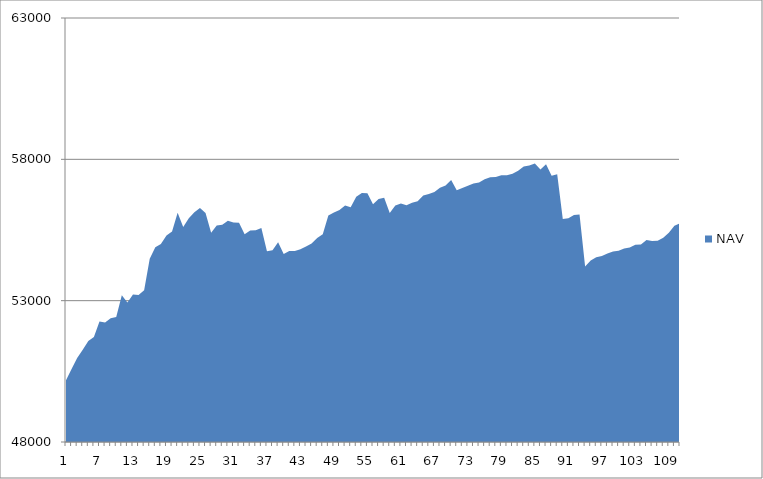
| Category | NAV |
|---|---|
| 0 | 50185.185 |
| 1 | 50585.185 |
| 2 | 50973.977 |
| 3 | 51265.977 |
| 4 | 51576.741 |
| 5 | 51711.523 |
| 6 | 52262.893 |
| 7 | 52230.24 |
| 8 | 52381.556 |
| 9 | 52425.915 |
| 10 | 53192.581 |
| 11 | 52939.146 |
| 12 | 53220.069 |
| 13 | 53197.341 |
| 14 | 53369.61 |
| 15 | 54480.721 |
| 16 | 54888.365 |
| 17 | 55001.902 |
| 18 | 55308.308 |
| 19 | 55448.308 |
| 20 | 56110.305 |
| 21 | 55610.305 |
| 22 | 55916.954 |
| 23 | 56129.798 |
| 24 | 56279.798 |
| 25 | 56105.301 |
| 26 | 55401.645 |
| 27 | 55657.201 |
| 28 | 55686.925 |
| 29 | 55823.001 |
| 30 | 55769.596 |
| 31 | 55759.375 |
| 32 | 55350.284 |
| 33 | 55480.284 |
| 34 | 55492.498 |
| 35 | 55570.42 |
| 36 | 54746.89 |
| 37 | 54783.7 |
| 38 | 55066.459 |
| 39 | 54651.074 |
| 40 | 54754.078 |
| 41 | 54760.213 |
| 42 | 54816.924 |
| 43 | 54917.296 |
| 44 | 55025.73 |
| 45 | 55220.535 |
| 46 | 55353.465 |
| 47 | 56009.309 |
| 48 | 56118.959 |
| 49 | 56205.212 |
| 50 | 56362.876 |
| 51 | 56307.394 |
| 52 | 56678.935 |
| 53 | 56813.264 |
| 54 | 56799.502 |
| 55 | 56409.112 |
| 56 | 56596.44 |
| 57 | 56640.493 |
| 58 | 56102.227 |
| 59 | 56370.449 |
| 60 | 56434.248 |
| 61 | 56376.841 |
| 62 | 56464.524 |
| 63 | 56518.022 |
| 64 | 56724.747 |
| 65 | 56770.361 |
| 66 | 56848.099 |
| 67 | 56992.896 |
| 68 | 57073.571 |
| 69 | 57266.481 |
| 70 | 56908.016 |
| 71 | 56984.939 |
| 72 | 57069.276 |
| 73 | 57147.627 |
| 74 | 57179.83 |
| 75 | 57291.17 |
| 76 | 57366.35 |
| 77 | 57371.599 |
| 78 | 57439.215 |
| 79 | 57440.895 |
| 80 | 57490.895 |
| 81 | 57593.679 |
| 82 | 57746.643 |
| 83 | 57785.413 |
| 84 | 57849.748 |
| 85 | 57639.346 |
| 86 | 57828.82 |
| 87 | 57417.055 |
| 88 | 57471.335 |
| 89 | 55888.376 |
| 90 | 55913.907 |
| 91 | 56031.989 |
| 92 | 56044.711 |
| 93 | 54210.631 |
| 94 | 54422.612 |
| 95 | 54536.647 |
| 96 | 54575.903 |
| 97 | 54670.229 |
| 98 | 54737.367 |
| 99 | 54762.386 |
| 100 | 54842.923 |
| 101 | 54881.385 |
| 102 | 54978.816 |
| 103 | 54991.283 |
| 104 | 55149.699 |
| 105 | 55109.498 |
| 106 | 55121.656 |
| 107 | 55227.569 |
| 108 | 55405.15 |
| 109 | 55650.183 |
| 110 | 55733.424 |